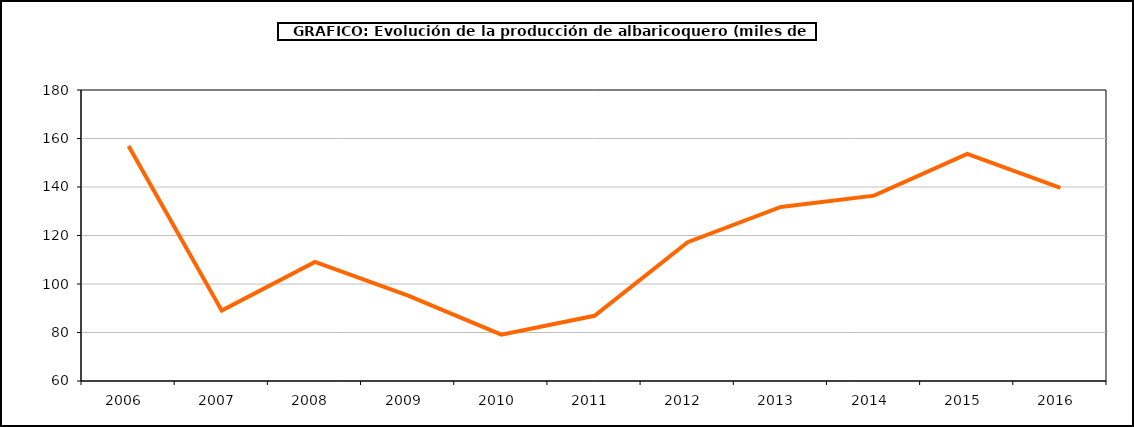
| Category | producción albaricoquero |
|---|---|
| 2006.0 | 156.872 |
| 2007.0 | 89.023 |
| 2008.0 | 109.108 |
| 2009.0 | 95.221 |
| 2010.0 | 79.101 |
| 2011.0 | 86.88 |
| 2012.0 | 117.24 |
| 2013.0 | 131.776 |
| 2014.0 | 136.446 |
| 2015.0 | 153.667 |
| 2016.0 | 139.605 |